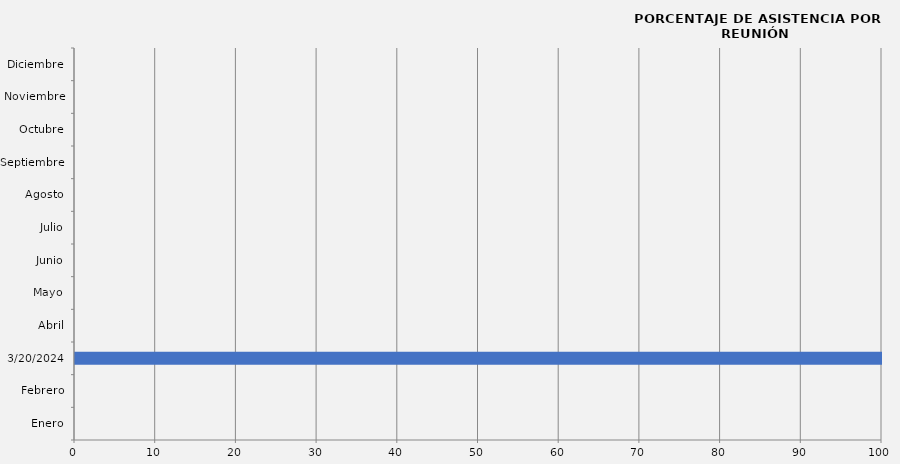
| Category | Series 0 |
|---|---|
| Enero | 0 |
| Febrero | 0 |
| 20/03/2024 | 100 |
| Abril | 0 |
| Mayo | 0 |
| Junio | 0 |
| Julio | 0 |
| Agosto | 0 |
| Septiembre | 0 |
| Octubre | 0 |
| Noviembre | 0 |
| Diciembre | 0 |